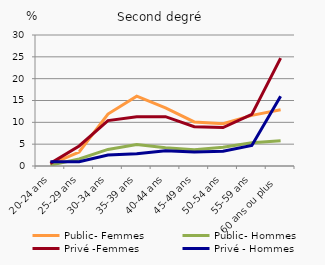
| Category | Public- Femmes | Public- Hommes | Privé -Femmes | Privé - Hommes |
|---|---|---|---|---|
| 20-24 ans | 0.4 | 0.2 | 0.6 | 1 |
| 25-29 ans | 3.2 | 1.6 | 4.6 | 1 |
| 30-34 ans | 11.9 | 3.8 | 10.4 | 2.5 |
| 35-39 ans | 16 | 4.9 | 11.3 | 2.8 |
| 40-44 ans | 13.3 | 4.2 | 11.3 | 3.5 |
| 45-49 ans | 10.1 | 3.7 | 9 | 3.2 |
| 50-54 ans | 9.7 | 4.3 | 8.8 | 3.4 |
| 55-59 ans | 11.6 | 5.3 | 11.8 | 4.7 |
| 60 ans ou plus | 12.9 | 5.8 | 24.7 | 16 |